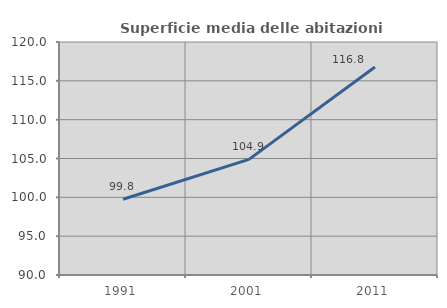
| Category | Superficie media delle abitazioni occupate |
|---|---|
| 1991.0 | 99.753 |
| 2001.0 | 104.883 |
| 2011.0 | 116.778 |